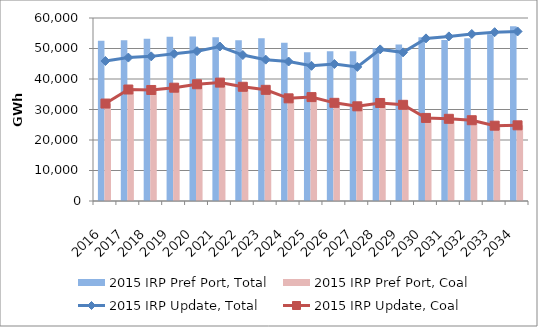
| Category | 2015 IRP Pref Port, Total | 2015 IRP Pref Port, Coal |
|---|---|---|
| 2016.0 | 52544.586 | 31950.701 |
| 2017.0 | 52734.501 | 36556.71 |
| 2018.0 | 53227.745 | 36398.876 |
| 2019.0 | 53816.555 | 37148.507 |
| 2020.0 | 53947.748 | 38274.97 |
| 2021.0 | 53663.863 | 38814.409 |
| 2022.0 | 52722.009 | 37449.518 |
| 2023.0 | 53384.132 | 36449.262 |
| 2024.0 | 51857.699 | 33660.635 |
| 2025.0 | 48808.126 | 34065.946 |
| 2026.0 | 49085.099 | 32183.433 |
| 2027.0 | 49076.41 | 31046.948 |
| 2028.0 | 50052.605 | 32139.766 |
| 2029.0 | 51330.439 | 31535.457 |
| 2030.0 | 53690.457 | 27235.827 |
| 2031.0 | 52816.457 | 26946.786 |
| 2032.0 | 53367.109 | 26485.065 |
| 2033.0 | 54671.274 | 24689.429 |
| 2034.0 | 57308.271 | 24814.088 |